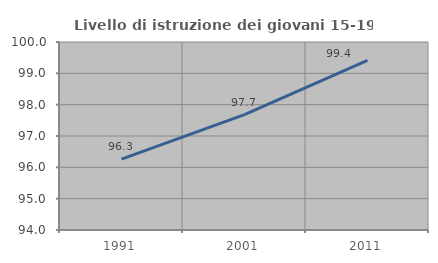
| Category | Livello di istruzione dei giovani 15-19 anni |
|---|---|
| 1991.0 | 96.26 |
| 2001.0 | 97.682 |
| 2011.0 | 99.414 |